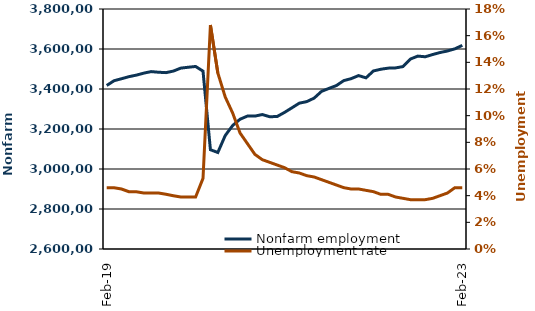
| Category |  Nonfarm employment  |
|---|---|
| 2019-02-01 | 3417600 |
| 2019-03-01 | 3441500 |
| 2019-04-01 | 3451300 |
| 2019-05-01 | 3461700 |
| 2019-06-01 | 3469300 |
| 2019-07-01 | 3479300 |
| 2019-08-01 | 3487000 |
| 2019-09-01 | 3483800 |
| 2019-10-01 | 3481800 |
| 2019-11-01 | 3489600 |
| 2019-12-01 | 3504400 |
| 2020-01-01 | 3508700 |
| 2020-02-01 | 3512700 |
| 2020-03-01 | 3489300 |
| 2020-04-01 | 3096400 |
| 2020-05-01 | 3082600 |
| 2020-06-01 | 3167400 |
| 2020-07-01 | 3217400 |
| 2020-08-01 | 3248900 |
| 2020-09-01 | 3264700 |
| 2020-10-01 | 3264400 |
| 2020-11-01 | 3272300 |
| 2020-12-01 | 3261400 |
| 2021-01-01 | 3262400 |
| 2021-02-01 | 3282900 |
| 2021-03-01 | 3305900 |
| 2021-04-01 | 3329200 |
| 2021-05-01 | 3336900 |
| 2021-06-01 | 3354400 |
| 2021-07-01 | 3388100 |
| 2021-08-01 | 3403100 |
| 2021-09-01 | 3417000 |
| 2021-10-01 | 3441900 |
| 2021-11-01 | 3451800 |
| 2021-12-01 | 3467100 |
| 2022-01-01 | 3455800 |
| 2022-02-01 | 3490200 |
| 2022-03-01 | 3498800 |
| 2022-04-01 | 3504300 |
| 2022-05-01 | 3505600 |
| 2022-06-01 | 3512000 |
| 2022-07-01 | 3549900 |
| 2022-08-01 | 3564500 |
| 2022-09-01 | 3561100 |
| 2022-10-01 | 3572400 |
| 2022-11-01 | 3582400 |
| 2022-12-01 | 3590100 |
| 2023-01-01 | 3600900 |
| 2023-02-01 | 3618100 |